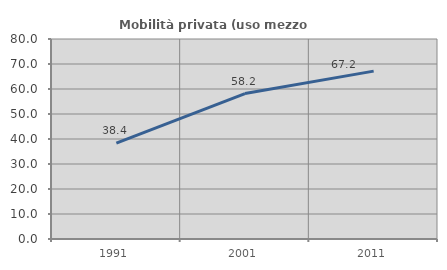
| Category | Mobilità privata (uso mezzo privato) |
|---|---|
| 1991.0 | 38.389 |
| 2001.0 | 58.165 |
| 2011.0 | 67.151 |